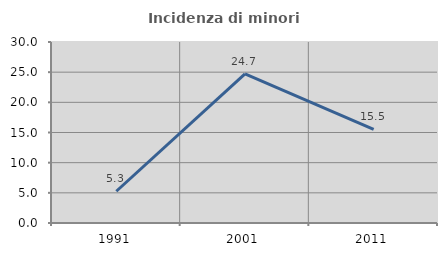
| Category | Incidenza di minori stranieri |
|---|---|
| 1991.0 | 5.263 |
| 2001.0 | 24.731 |
| 2011.0 | 15.508 |